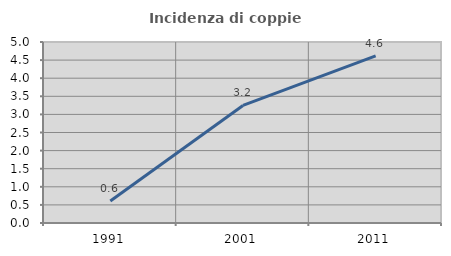
| Category | Incidenza di coppie miste |
|---|---|
| 1991.0 | 0.61 |
| 2001.0 | 3.247 |
| 2011.0 | 4.615 |